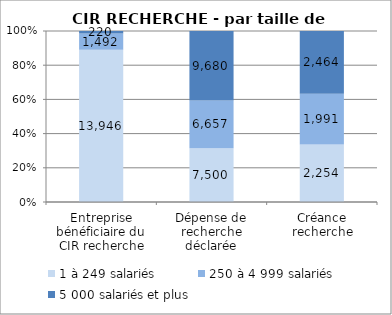
| Category | 1 à 249 salariés | 250 à 4 999 salariés | 5 000 salariés et plus |
|---|---|---|---|
| Entreprise bénéficiaire du CIR recherche | 13946 | 1492 | 220 |
| Dépense de recherche déclarée | 7499.94 | 6657.11 | 9679.75 |
| Créance recherche | 2254.07 | 1991.13 | 2464.28 |